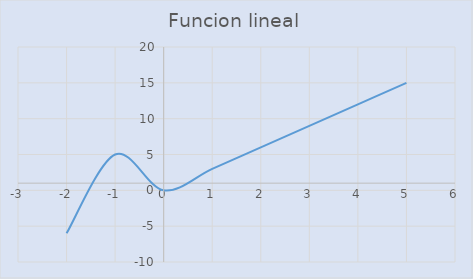
| Category | Series 0 |
|---|---|
| -2.0 | -6 |
| -1.0 | 5 |
| 0.0 | 0 |
| 1.0 | 3 |
| 2.0 | 6 |
| 3.0 | 9 |
| 4.0 | 12 |
| 5.0 | 15 |